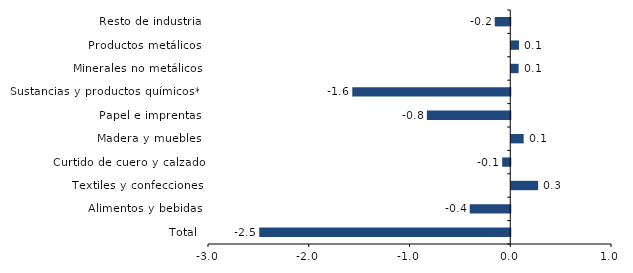
| Category | Series 0 |
|---|---|
| Total | -2.492 |
| Alimentos y bebidas | -0.402 |
| Textiles y confecciones | 0.267 |
| Curtido de cuero y calzado | -0.08 |
| Madera y muebles | 0.123 |
| Papel e imprentas | -0.828 |
| Sustancias y productos químicos** | -1.568 |
| Minerales no metálicos | 0.073 |
| Productos metálicos | 0.077 |
| Resto de industria | -0.154 |